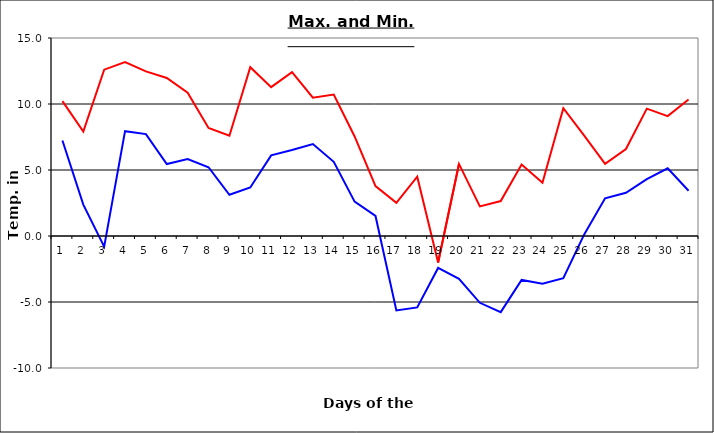
| Category | Series 0 | Series 1 |
|---|---|---|
| 0 | 10.22 | 7.23 |
| 1 | 7.92 | 2.38 |
| 2 | 12.6 | -0.81 |
| 3 | 13.17 | 7.94 |
| 4 | 12.47 | 7.72 |
| 5 | 11.97 | 5.45 |
| 6 | 10.85 | 5.83 |
| 7 | 8.19 | 5.21 |
| 8 | 7.6 | 3.12 |
| 9 | 12.79 | 3.68 |
| 10 | 11.28 | 6.11 |
| 11 | 12.41 | 6.51 |
| 12 | 10.48 | 6.97 |
| 13 | 10.72 | 5.62 |
| 14 | 7.54 | 2.6 |
| 15 | 3.78 | 1.52 |
| 16 | 2.51 | -5.64 |
| 17 | 4.49 | -5.41 |
| 18 | -2.01 | -2.42 |
| 19 | 5.46 | -3.25 |
| 20 | 2.24 | -5.06 |
| 21 | 2.65 | -5.77 |
| 22 | 5.41 | -3.33 |
| 23 | 4.03 | -3.62 |
| 24 | 9.68 | -3.19 |
| 25 | 7.61 | 0.12 |
| 26 | 5.47 | 2.86 |
| 27 | 6.59 | 3.27 |
| 28 | 9.65 | 4.31 |
| 29 | 9.08 | 5.13 |
| 30 | 10.34 | 3.43 |